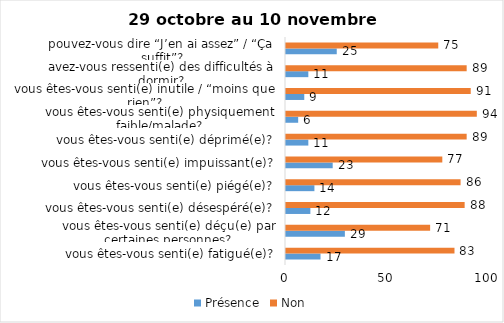
| Category | Présence | Non |
|---|---|---|
| vous êtes-vous senti(e) fatigué(e)? | 17 | 83 |
| vous êtes-vous senti(e) déçu(e) par certaines personnes? | 29 | 71 |
| vous êtes-vous senti(e) désespéré(e)? | 12 | 88 |
| vous êtes-vous senti(e) piégé(e)? | 14 | 86 |
| vous êtes-vous senti(e) impuissant(e)? | 23 | 77 |
| vous êtes-vous senti(e) déprimé(e)? | 11 | 89 |
| vous êtes-vous senti(e) physiquement faible/malade? | 6 | 94 |
| vous êtes-vous senti(e) inutile / “moins que rien”? | 9 | 91 |
| avez-vous ressenti(e) des difficultés à dormir? | 11 | 89 |
| pouvez-vous dire “J’en ai assez” / “Ça suffit”? | 25 | 75 |